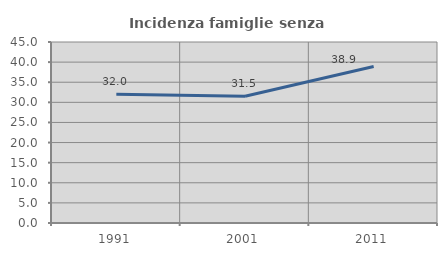
| Category | Incidenza famiglie senza nuclei |
|---|---|
| 1991.0 | 31.981 |
| 2001.0 | 31.522 |
| 2011.0 | 38.904 |